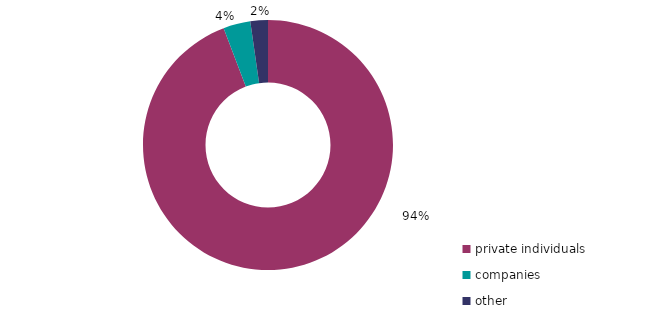
| Category | Series 0 |
|---|---|
| private individuals | 94.226 |
| companies | 3.505 |
| other | 2.27 |